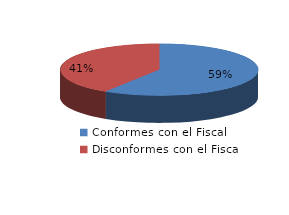
| Category | Series 0 |
|---|---|
| 0 | 937 |
| 1 | 651 |